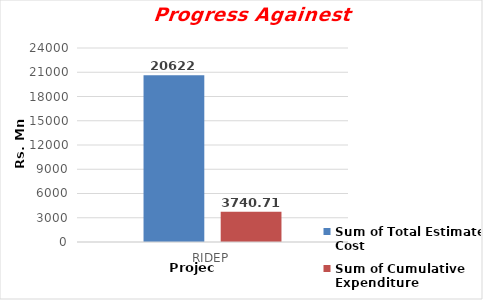
| Category | Sum of Total Estimate Cost | Sum of Cumulative Expenditure  |
|---|---|---|
| RIDEP | 20622 | 3740.71 |